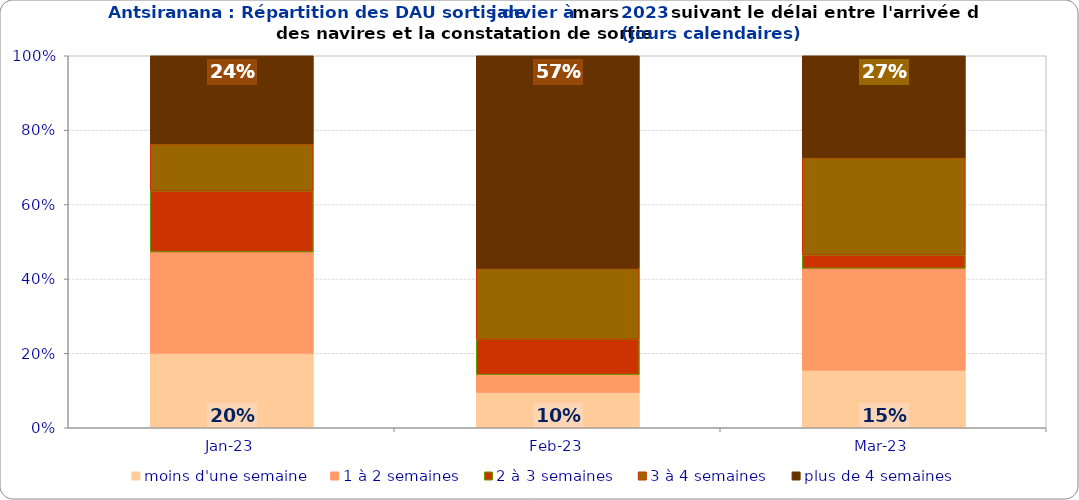
| Category | moins d'une semaine | 1 à 2 semaines | 2 à 3 semaines | 3 à 4 semaines | plus de 4 semaines |
|---|---|---|---|---|---|
| 2023-01-01 | 0.2 | 0.273 | 0.164 | 0.127 | 0.236 |
| 2023-02-01 | 0.095 | 0.048 | 0.095 | 0.19 | 0.571 |
| 2023-03-01 | 0.155 | 0.274 | 0.036 | 0.262 | 0.274 |